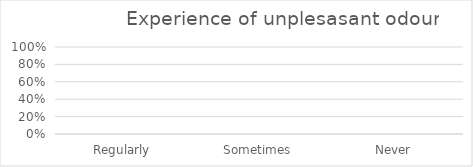
| Category | Series 0 |
|---|---|
| Regularly | 0 |
| Sometimes | 0 |
| Never | 0 |